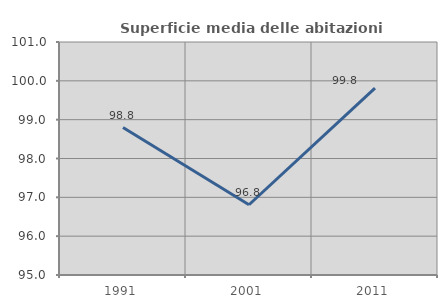
| Category | Superficie media delle abitazioni occupate |
|---|---|
| 1991.0 | 98.798 |
| 2001.0 | 96.809 |
| 2011.0 | 99.811 |